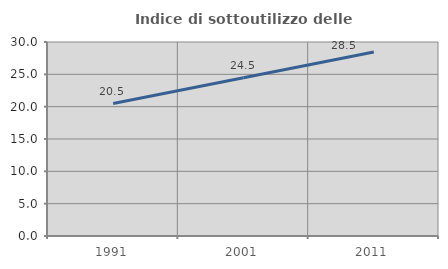
| Category | Indice di sottoutilizzo delle abitazioni  |
|---|---|
| 1991.0 | 20.478 |
| 2001.0 | 24.471 |
| 2011.0 | 28.451 |